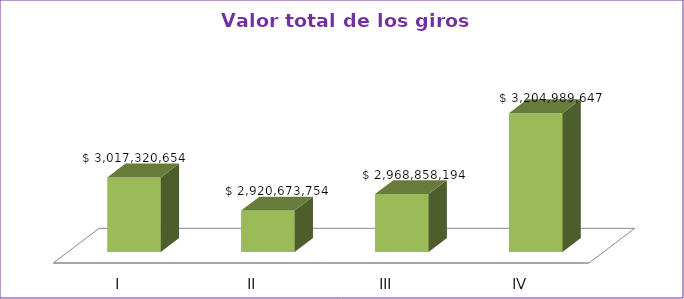
| Category | Series 0 |
|---|---|
| I | 3017320654 |
| II | 2920673754 |
| III | 2968858194 |
| IV | 3204989647 |